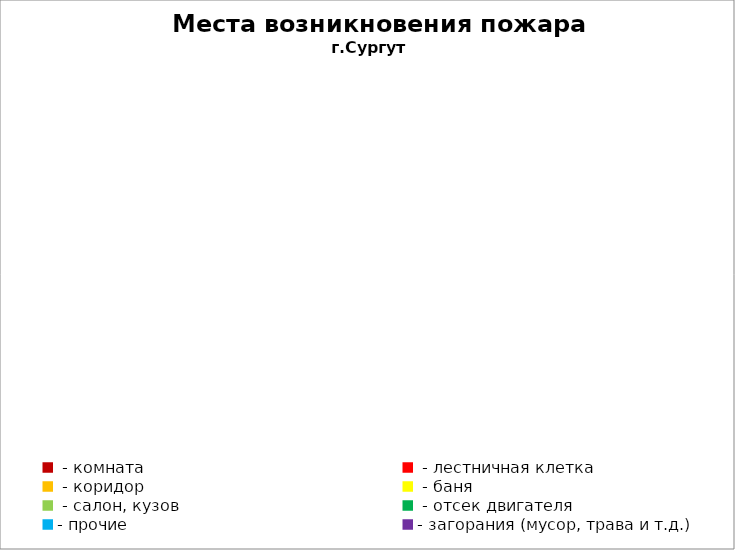
| Category | Места возникновения пожара |
|---|---|
|  - комната | 44 |
|  - лестничная клетка | 4 |
|  - коридор | 3 |
|  - баня | 11 |
|  - салон, кузов | 10 |
|  - отсек двигателя | 19 |
| - прочие | 53 |
| - загорания (мусор, трава и т.д.)  | 52 |